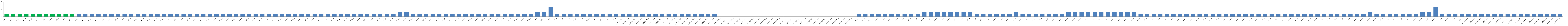
| Category | Series 0 |
|---|---|
| AW01 | 1 |
| AW02 | 1 |
| AW03 | 1 |
| AW04 | 1 |
| AW05 | 1 |
| AW06 | 1 |
| AW07 | 1 |
| AW08 | 1 |
| AW09 | 1 |
| AW10 | 1 |
| AW11 | 1 |
| AW12 | 1 |
| AW13 | 1 |
| AW14 | 1 |
| AW15 | 1 |
| AW16 | 1 |
| AW17 | 1 |
| AW18 | 1 |
| AW19 | 1 |
| AW20 | 1 |
| AW21 | 1 |
| AW22 | 1 |
| AW23 | 1 |
| AW24 | 1 |
| AW25 | 1 |
| AW26 | 1 |
| AW27 | 1 |
| AW28 | 1 |
| AW29 | 1 |
| BW01 | 1 |
| BW02 | 1 |
| BW03 | 1 |
| BWO4 | 1 |
| BW05 | 1 |
| BW06 | 1 |
| BW07 | 1 |
| BW08 | 1 |
| BW09 | 1 |
| BW10 | 1 |
| BW11 | 1 |
| BW12 | 1 |
| BW13 | 1 |
| BW14 | 1 |
| BW15 | 1 |
| BW16 | 1 |
| BW17 | 1 |
| BW18 | 1 |
| BW19 | 1 |
| BW20 | 1 |
| BW21 | 1 |
| BW22 | 1 |
| BW23 | 1 |
| BW24 | 1 |
| BW25 | 1 |
| BW26 | 1 |
| BW27 | 1 |
| BW28 | 1 |
| BW29 | 1 |
| BW30 | 1 |
| BW31 | 1 |
| BW32 | 2 |
| BW33 | 2 |
| BW34 | 1 |
| BW35 | 1 |
| BW36 | 1 |
| BW37 | 1 |
| BW38 | 1 |
| BW39 | 1 |
| BW40 | 1 |
| BW41 | 1 |
| BW42 | 1 |
| BW43 | 1 |
| BW44 | 1 |
| BW45 | 1 |
| BW46 | 1 |
| BW47 | 1 |
| BW48 | 1 |
| BW49 | 1 |
| BW50 | 1 |
| BW51 | 1 |
| BW52 | 1 |
| CW01 | 2 |
| CW02 | 2 |
| CW03 | 4 |
| CW04 | 1 |
| CW05 | 1 |
| CW06 | 1 |
| CW07 | 1 |
| CW08 | 1 |
| CW09 | 1 |
| CW10 | 1 |
| CW11 | 1 |
| CW12 | 1 |
| CW13 | 1 |
| AUMED. W01 | 1 |
| AUMED. W02 | 1 |
| AUMED. W03 | 1 |
| AUMED. W04 | 1 |
| AUMED. W05 | 1 |
| AUMED. W06 | 1 |
| AUMED. W07 | 1 |
| AUMED. W08 | 1 |
| AUMED.W09 | 1 |
| AUMED. W10 | 1 |
| AUMED. W11 | 1 |
| AUMED. W12 | 1 |
| AUMED. W13 | 1 |
| AUMED. W14 | 1 |
| AUMED. W15 | 1 |
| BUMED.W01 | 0 |
| BUMED.W02 | 0 |
| BUMED.W03 | 0 |
| BUMED.W04 | 0 |
| BUMED.W05 | 0 |
| BUMED.W06 | 0 |
| BUMED.W07 | 0 |
| BUMED.W08 | 0 |
| BUMED.W09 | 0 |
| BUMED.W10 | 0 |
| BUMED.W11 | 0 |
| BUMED.W12 | 0 |
| BUMED.W13 | 0 |
| BUMED.W14 | 0 |
| BUMED.W15 | 0 |
| BUMED.W16 | 0 |
| BUMED.W17 | 0 |
| BUMED.W18 | 0 |
| BUMED.W19 | 0 |
| BUMED.W20 | 0 |
| BUMED.W21 | 0 |
| AW22* | 1 |
| AW23* | 1 |
| AW24* | 1 |
| AW25* | 1 |
| AU01 | 1 |
| AU02 | 1 |
| AU03 | 1 |
| AU04 | 1 |
| AU05 | 1 |
| AU06 | 1 |
| AU07 | 2 |
| AU08 | 2 |
| AU09 | 2 |
| AU10 | 2 |
| AU11 | 2 |
| AU12 | 2 |
| AU13 | 2 |
| AU14 | 2 |
| AU15 | 1 |
| AU16 | 1 |
| AU17 | 1 |
| AU18 | 1 |
| AU19 | 1 |
| AU20 | 1 |
| AU21 | 2 |
| BU01 | 1 |
| BU02 | 1 |
| BU03 | 1 |
| BU04 | 1 |
| BU05 | 1 |
| BU06 | 1 |
| BU07 | 1 |
| BU08 | 2 |
| BU09 | 2 |
| BU10 | 2 |
| BU11 | 2 |
| BU12 | 2 |
| BU13 | 2 |
| BU14 | 2 |
| BU15 | 2 |
| BU16 | 2 |
| BU17 | 2 |
| BU18 | 2 |
| BU19 | 1 |
| BU20 | 1 |
| BU21 | 1 |
| BU22 | 1 |
| BU23 | 1 |
| BU24 | 1 |
| BU25 | 1 |
| BU26 | 1 |
| BU27 | 1 |
| BU28 | 1 |
| BU29 | 1 |
| BU30 | 1 |
| BU31 | 1 |
| BU32 | 1 |
| BU33 | 1 |
| BU34 | 1 |
| BU35 | 1 |
| BU36 | 1 |
| BU37 | 1 |
| BU38 | 1 |
| BU39 | 1 |
| BU40 | 1 |
| BU41 | 1 |
| BU42 | 1 |
| BU43 | 1 |
| BU44 | 1 |
| BU45 | 1 |
| BU46 | 1 |
| BU47 | 1 |
| BU48 | 1 |
| BU49 | 1 |
| BU50 | 1 |
| BU51 | 1 |
| BU52 | 1 |
| BU53 | 1 |
| BU54 | 2 |
| BU55 | 1 |
| BU56 | 1 |
| BU57 | 1 |
| BU58 | 1 |
| BU59 | 1 |
| BU60 | 1 |
| BU61 | 1 |
| CU01 | 2 |
| CU02 | 2 |
| CU03 | 4 |
| CU04 | 1 |
| CU05 | 1 |
| CU06 | 1 |
| CU07 | 1 |
| AUMED.U01 | 1 |
| AUMED.U02 | 1 |
| AUMED.U03 | 1 |
| AUMED.U04 | 1 |
| AUMED.U05 | 1 |
| AUMED.U06 | 1 |
| AUMED.U07 | 1 |
| AUMED.U08 | 1 |
| AUMED.U09 | 1 |
| AUMED.U10 | 1 |
| AUMED.U11 | 1 |
| AUMED.U12 | 1 |
| AUMED.U13 | 1 |
| AUMED.U14 | 1 |
| AUMED.U15 | 1 |